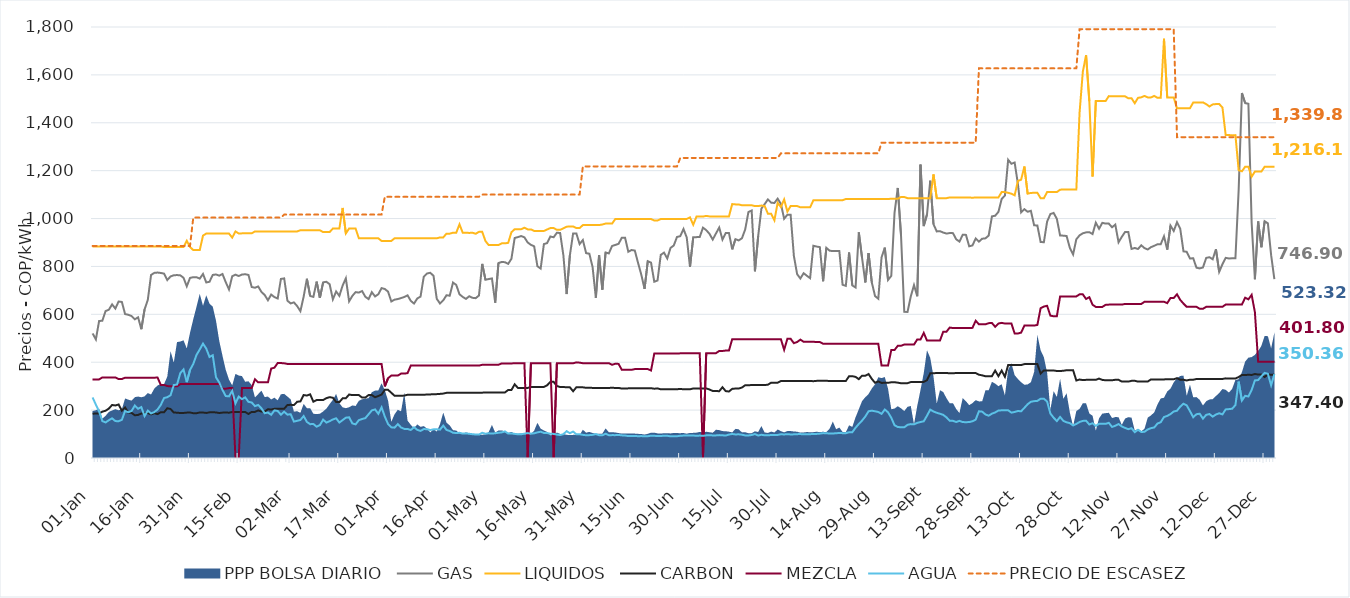
| Category | GAS | LIQUIDOS | CARBON | MEZCLA | AGUA | PRECIO DE ESCASEZ |
|---|---|---|---|---|---|---|
| 0 | 520.226 | 883.355 | 184.655 | 328.274 | 252.743 | 885.729 |
| 1900-01-01 | 495.19 | 883.355 | 186.097 | 328.274 | 222.679 | 885.729 |
| 1900-01-02 | 572.077 | 883.355 | 186.097 | 328.274 | 194.33 | 885.729 |
| 1900-01-03 | 573.32 | 883.355 | 193.517 | 336.473 | 154.081 | 885.729 |
| 1900-01-04 | 613.778 | 883.355 | 197.451 | 336.473 | 148.479 | 885.729 |
| 1900-01-05 | 619.263 | 883.355 | 206.35 | 336.473 | 157.968 | 885.729 |
| 1900-01-06 | 641.599 | 883.355 | 221.479 | 336.473 | 165.61 | 885.729 |
| 1900-01-07 | 624.019 | 883.402 | 219.356 | 336.473 | 154.121 | 885.729 |
| 1900-01-08 | 653.492 | 883.402 | 223.48 | 329.744 | 153.708 | 885.729 |
| 1900-01-09 | 651.856 | 883.402 | 197.766 | 329.744 | 159.356 | 885.729 |
| 1900-01-10 | 601.171 | 883.402 | 211.078 | 335.502 | 196.263 | 885.729 |
| 1900-01-11 | 598.072 | 883.402 | 189.093 | 335.502 | 191.205 | 885.729 |
| 1900-01-12 | 592.782 | 883.576 | 188.323 | 335.502 | 196.502 | 885.729 |
| 1900-01-13 | 579.264 | 883.576 | 178.348 | 335.502 | 219.282 | 885.729 |
| 1900-01-14 | 587.664 | 883.576 | 179.885 | 335.502 | 205.541 | 885.729 |
| 1900-01-15 | 537.89 | 883.576 | 185.696 | 335.473 | 212.525 | 885.729 |
| 1900-01-16 | 620.455 | 883.576 | 187.538 | 335.473 | 175.1 | 885.729 |
| 1900-01-17 | 660.565 | 883.576 | 187.785 | 335.473 | 197.855 | 885.729 |
| 1900-01-18 | 764.231 | 883.576 | 182.23 | 335.473 | 186.123 | 885.729 |
| 1900-01-19 | 773.113 | 883.576 | 187.213 | 335.502 | 191.726 | 885.729 |
| 1900-01-20 | 774.478 | 883.576 | 183.233 | 335.918 | 202.643 | 885.729 |
| 1900-01-21 | 772.763 | 883.576 | 191.273 | 305.125 | 221.923 | 885.729 |
| 1900-01-22 | 770.06 | 881.261 | 190.914 | 305.125 | 250.397 | 885.729 |
| 1900-01-23 | 743.273 | 881.261 | 207.706 | 300.495 | 253.961 | 885.729 |
| 1900-01-24 | 758.156 | 881.261 | 204.672 | 299.203 | 262.078 | 885.729 |
| 1900-01-25 | 763.174 | 881.261 | 189.811 | 299.203 | 304.68 | 885.729 |
| 1900-01-26 | 764.026 | 881.261 | 189.352 | 299.203 | 306.961 | 885.729 |
| 1900-01-27 | 762.766 | 881.261 | 187.888 | 308.752 | 354.241 | 885.729 |
| 1900-01-28 | 752.574 | 881.261 | 188.162 | 308.752 | 369.797 | 885.729 |
| 1900-01-29 | 717.026 | 907.181 | 189.488 | 308.752 | 316.907 | 885.729 |
| 1900-01-30 | 752.088 | 881.261 | 189.951 | 308.752 | 367.916 | 885.729 |
| 1900-01-31 | 755.145 | 868.316 | 187.148 | 309.312 | 392.801 | 1004 |
| 1900-02-01 | 755.068 | 868.316 | 187.155 | 309.312 | 430.431 | 1004 |
| 1900-02-02 | 749.131 | 868.371 | 190.092 | 309.312 | 453.319 | 1004 |
| 1900-02-03 | 768.626 | 928.718 | 189.85 | 309.312 | 477.77 | 1004 |
| 1900-02-04 | 733.194 | 937.331 | 188.176 | 309.312 | 456.861 | 1004 |
| 1900-02-05 | 736.052 | 937.331 | 190.652 | 309.312 | 421.956 | 1004 |
| 1900-02-06 | 764.639 | 937.331 | 191.107 | 309.276 | 429.166 | 1004 |
| 1900-02-07 | 766.448 | 937.331 | 190.301 | 309.276 | 337.107 | 1004 |
| 1900-02-08 | 761.602 | 937.331 | 187.87 | 309.276 | 315.424 | 1004 |
| 1900-02-09 | 768.553 | 937.331 | 189.481 | 289.274 | 284.288 | 1004 |
| 1900-02-10 | 734.412 | 937.331 | 190.093 | 289.274 | 258.703 | 1004 |
| 1900-02-11 | 703.959 | 937.331 | 189.207 | 291.978 | 257.43 | 1004 |
| 1900-02-12 | 759.067 | 920.531 | 192.154 | 291.978 | 280.627 | 1004 |
| 1900-02-13 | 765.693 | 946.212 | 192.154 | 0 | 228.574 | 1004 |
| 1900-02-14 | 759.937 | 937.745 | 191.768 | 0 | 256.456 | 1004 |
| 1900-02-15 | 766.175 | 938.122 | 191.768 | 291.978 | 245.889 | 1004 |
| 1900-02-16 | 767.474 | 938.122 | 192.156 | 291.978 | 253.112 | 1004 |
| 1900-02-17 | 764.515 | 938.164 | 183.876 | 291.978 | 234.488 | 1004 |
| 1900-02-18 | 714.133 | 938.164 | 192.598 | 291.978 | 231.856 | 1004 |
| 1900-02-19 | 711.106 | 946.297 | 192.61 | 328.667 | 216.789 | 1004 |
| 1900-02-20 | 716.412 | 946.297 | 198.772 | 315.849 | 221.514 | 1004 |
| 1900-02-21 | 693.6 | 946.297 | 193.804 | 315.849 | 207.397 | 1004 |
| 1900-02-22 | 680.697 | 946.297 | 194.178 | 315.849 | 187.162 | 1004 |
| 1900-02-23 | 658.782 | 946.297 | 203.588 | 315.849 | 189.878 | 1004 |
| 1900-02-24 | 682.461 | 946.297 | 202.434 | 373.499 | 180.456 | 1004 |
| 1900-02-25 | 672.15 | 946.297 | 205.572 | 377.277 | 198.722 | 1004 |
| 1900-02-26 | 666.018 | 946.297 | 205.572 | 396.545 | 196.472 | 1004 |
| 1900-02-27 | 747.813 | 946.297 | 206.139 | 396.545 | 180.858 | 1004 |
| 1900-02-28 | 750.156 | 946.224 | 205.753 | 395.437 | 193.233 | 1016.591 |
| 1900-02-28 | 656.943 | 946.224 | 221.252 | 392.879 | 181.047 | 1016.591 |
| 1900-03-01 | 645.614 | 946.224 | 222.146 | 392.879 | 182.888 | 1016.591 |
| 1900-03-02 | 649.864 | 946.224 | 220.939 | 392.879 | 152.143 | 1016.591 |
| 1900-03-03 | 634.457 | 946.224 | 234.899 | 392.879 | 155.283 | 1016.591 |
| 1900-03-04 | 613.276 | 951.269 | 236.342 | 392.879 | 158.788 | 1016.591 |
| 1900-03-05 | 673.885 | 951.269 | 263.018 | 392.879 | 175.164 | 1016.591 |
| 1900-03-06 | 748.508 | 951.269 | 260.744 | 392.879 | 150.685 | 1016.591 |
| 1900-03-07 | 676.691 | 951.269 | 265.949 | 392.879 | 141.311 | 1016.591 |
| 1900-03-08 | 672.928 | 951.049 | 234.996 | 392.879 | 141.898 | 1016.591 |
| 1900-03-09 | 736.6 | 951.049 | 242.017 | 392.879 | 130.732 | 1016.591 |
| 1900-03-10 | 668.471 | 951.049 | 242.017 | 392.879 | 137.422 | 1016.591 |
| 1900-03-11 | 733.519 | 943.522 | 242.017 | 392.879 | 160.203 | 1016.591 |
| 1900-03-12 | 736.034 | 943.522 | 249.959 | 392.879 | 147.907 | 1016.591 |
| 1900-03-13 | 725.859 | 943.522 | 254.051 | 392.879 | 153.853 | 1016.591 |
| 1900-03-14 | 662.456 | 958.315 | 251.69 | 392.879 | 160.91 | 1016.591 |
| 1900-03-15 | 695.33 | 958.315 | 234.065 | 392.879 | 165.861 | 1016.591 |
| 1900-03-16 | 677.135 | 958.315 | 233.301 | 392.879 | 148.141 | 1016.591 |
| 1900-03-17 | 720.054 | 1044.442 | 249.165 | 392.879 | 158.189 | 1016.591 |
| 1900-03-18 | 750.379 | 938.139 | 249.61 | 392.879 | 168.318 | 1016.591 |
| 1900-03-19 | 654.206 | 958.337 | 265.026 | 392.861 | 169.984 | 1016.591 |
| 1900-03-20 | 676.899 | 958.337 | 262.757 | 392.861 | 144.533 | 1016.591 |
| 1900-03-21 | 692.767 | 958.337 | 262.757 | 392.861 | 140.506 | 1016.591 |
| 1900-03-22 | 690.868 | 917.498 | 262.757 | 392.861 | 157.968 | 1016.591 |
| 1900-03-23 | 697.252 | 917.498 | 252.398 | 392.861 | 162.927 | 1016.591 |
| 1900-03-24 | 673.358 | 917.498 | 252.398 | 392.861 | 166.429 | 1016.591 |
| 1900-03-25 | 663.608 | 917.498 | 262.813 | 392.861 | 182.605 | 1016.591 |
| 1900-03-26 | 692.581 | 917.498 | 262.813 | 392.861 | 198.854 | 1016.591 |
| 1900-03-27 | 674.641 | 917.498 | 253.749 | 392.861 | 202.911 | 1016.591 |
| 1900-03-28 | 683.85 | 917.498 | 258.967 | 392.861 | 184.61 | 1016.591 |
| 1900-03-29 | 709.512 | 906.627 | 264.87 | 392.861 | 211.776 | 1016.591 |
| 1900-03-30 | 705.818 | 906.535 | 284.521 | 299.126 | 172.887 | 1090.843 |
| 1900-03-31 | 694.863 | 906.535 | 284.521 | 333.191 | 141.739 | 1090.843 |
| 1900-04-01 | 653.647 | 906.535 | 272.534 | 344.248 | 127.997 | 1090.843 |
| 1900-04-02 | 661.3 | 917.415 | 259.737 | 344.248 | 126.719 | 1090.843 |
| 1900-04-03 | 663.776 | 917.415 | 259.737 | 344.248 | 141.479 | 1090.843 |
| 1900-04-04 | 667.795 | 917.415 | 259.737 | 352.402 | 127.418 | 1090.843 |
| 1900-04-05 | 672.4 | 917.415 | 260.754 | 352.402 | 121.535 | 1090.843 |
| 1900-04-06 | 679.439 | 917.415 | 264.094 | 354.458 | 121.306 | 1090.843 |
| 1900-04-07 | 656.223 | 917.415 | 264.094 | 385.951 | 117.012 | 1090.843 |
| 1900-04-08 | 644.986 | 917.415 | 264.094 | 385.951 | 128.474 | 1090.843 |
| 1900-04-09 | 666.242 | 917.415 | 264.094 | 385.951 | 117.554 | 1090.843 |
| 1900-04-10 | 674.078 | 917.415 | 264.094 | 385.951 | 113.146 | 1090.843 |
| 1900-04-11 | 757.191 | 917.415 | 264.094 | 385.951 | 120.719 | 1090.843 |
| 1900-04-12 | 770.519 | 917.415 | 265.171 | 385.951 | 120.428 | 1090.843 |
| 1900-04-13 | 773.63 | 917.415 | 265.48 | 385.951 | 116.799 | 1090.843 |
| 1900-04-14 | 760.937 | 917.415 | 266.754 | 385.951 | 119.608 | 1090.843 |
| 1900-04-15 | 664.894 | 917.415 | 266.754 | 385.951 | 119.939 | 1090.843 |
| 1900-04-16 | 644.989 | 921.403 | 267.735 | 385.951 | 118.534 | 1090.843 |
| 1900-04-17 | 658.457 | 921.403 | 269.08 | 385.951 | 135.334 | 1090.843 |
| 1900-04-18 | 679.775 | 937.038 | 272.066 | 385.951 | 117.239 | 1090.843 |
| 1900-04-19 | 677.714 | 937.038 | 272.066 | 385.951 | 112.744 | 1090.843 |
| 1900-04-20 | 732.776 | 940.825 | 272.066 | 385.951 | 105.626 | 1090.843 |
| 1900-04-21 | 722.749 | 940.825 | 272.066 | 385.951 | 104.234 | 1090.843 |
| 1900-04-22 | 683.739 | 975.886 | 272.066 | 385.951 | 105.206 | 1090.843 |
| 1900-04-23 | 672.722 | 940.825 | 272.066 | 385.951 | 101.845 | 1090.843 |
| 1900-04-24 | 664.504 | 940.825 | 272.644 | 385.951 | 102.858 | 1090.843 |
| 1900-04-25 | 675.516 | 939.999 | 272.644 | 385.951 | 101.125 | 1090.843 |
| 1900-04-26 | 668.92 | 940.825 | 272.644 | 385.951 | 99.339 | 1090.843 |
| 1900-04-27 | 667.528 | 936.509 | 272.65 | 385.951 | 98.182 | 1090.843 |
| 1900-04-28 | 678.698 | 944.468 | 272.421 | 385.951 | 97.644 | 1090.843 |
| 1900-04-29 | 810.606 | 944.569 | 272.958 | 389.368 | 105.465 | 1100.221 |
| 1900-04-30 | 744.388 | 906.046 | 273.368 | 389.368 | 101.25 | 1100.221 |
| 1900-05-01 | 747.315 | 889.134 | 273.368 | 389.368 | 103.113 | 1100.221 |
| 1900-05-02 | 749.902 | 889.134 | 273.368 | 389.368 | 101.828 | 1100.221 |
| 1900-05-03 | 648.703 | 889.134 | 273.368 | 389.368 | 103.431 | 1100.221 |
| 1900-05-04 | 814.159 | 889.134 | 273.598 | 389.434 | 105.432 | 1100.221 |
| 1900-05-05 | 818.599 | 896.453 | 273.885 | 395.007 | 107.078 | 1100.221 |
| 1900-05-06 | 817.788 | 896.453 | 273.885 | 395.007 | 110.953 | 1100.221 |
| 1900-05-07 | 810.717 | 898.53 | 284.053 | 395.007 | 101.858 | 1100.221 |
| 1900-05-08 | 832.085 | 943.105 | 284.053 | 395.007 | 102.692 | 1100.221 |
| 1900-05-09 | 918.938 | 955.385 | 307.625 | 395.557 | 100.735 | 1100.221 |
| 1900-05-10 | 922.513 | 955.385 | 292.643 | 395.557 | 98.843 | 1100.221 |
| 1900-05-11 | 927.026 | 955.385 | 292.643 | 395.557 | 99.195 | 1100.221 |
| 1900-05-12 | 921.479 | 961.745 | 292.643 | 395.557 | 101.622 | 1100.221 |
| 1900-05-13 | 900.284 | 954.771 | 292.643 | 0 | 103.995 | 1100.221 |
| 1900-05-14 | 890.262 | 954.771 | 296.458 | 395.557 | 101.598 | 1100.221 |
| 1900-05-15 | 884.252 | 948.15 | 296.458 | 395.557 | 103.133 | 1100.221 |
| 1900-05-16 | 800.931 | 948.15 | 296.458 | 395.557 | 106.922 | 1100.221 |
| 1900-05-17 | 791.082 | 948.15 | 296.458 | 395.557 | 109.859 | 1100.221 |
| 1900-05-18 | 893.421 | 948.15 | 296.896 | 395.557 | 104.656 | 1100.221 |
| 1900-05-19 | 897.563 | 954.343 | 303.723 | 395.557 | 104.168 | 1100.221 |
| 1900-05-20 | 924.992 | 960.386 | 318.044 | 395.557 | 101.367 | 1100.221 |
| 1900-05-21 | 921.853 | 960.386 | 318.044 | 0 | 100.622 | 1100.221 |
| 1900-05-22 | 940.626 | 952.917 | 300.59 | 395.557 | 97.819 | 1100.221 |
| 1900-05-23 | 939.821 | 952.917 | 296.458 | 395.557 | 95.786 | 1100.221 |
| 1900-05-24 | 846.637 | 959.145 | 296.458 | 395.557 | 99.368 | 1100.221 |
| 1900-05-25 | 684.697 | 966.003 | 295.306 | 395.557 | 112.149 | 1100.221 |
| 1900-05-26 | 846.269 | 967.149 | 295.306 | 395.557 | 103.425 | 1100.221 |
| 1900-05-27 | 937.923 | 967.149 | 278.764 | 395.557 | 110.399 | 1100.221 |
| 1900-05-28 | 937.698 | 960.307 | 295.306 | 399.421 | 98.891 | 1100.221 |
| 1900-05-29 | 893.489 | 960.307 | 295.306 | 398.186 | 99.134 | 1100.221 |
| 1900-05-30 | 910.327 | 972.714 | 295.203 | 395.872 | 96.748 | 1217.8 |
| 1900-05-31 | 855.573 | 972.832 | 293.041 | 395.872 | 94.861 | 1217.8 |
| 1900-06-01 | 853.153 | 972.832 | 293.394 | 395.872 | 95.495 | 1217.8 |
| 1900-06-02 | 797.138 | 972.832 | 292.724 | 395.872 | 96.633 | 1217.8 |
| 1900-06-03 | 669.382 | 972.832 | 292.724 | 395.872 | 100.01 | 1217.8 |
| 1900-06-04 | 847.87 | 972.832 | 292.724 | 395.872 | 95.185 | 1217.8 |
| 1900-06-05 | 703.011 | 975.088 | 292.724 | 395.872 | 94.909 | 1217.8 |
| 1900-06-06 | 858.374 | 979.006 | 292.724 | 395.872 | 101.385 | 1217.8 |
| 1900-06-07 | 854.355 | 979.006 | 292.724 | 395.872 | 95.172 | 1217.8 |
| 1900-06-08 | 885.466 | 979.006 | 293.075 | 389.321 | 95.573 | 1217.8 |
| 1900-06-09 | 889.772 | 998.062 | 292.724 | 393.806 | 95.479 | 1217.8 |
| 1900-06-10 | 894.454 | 998.062 | 292.724 | 392.933 | 96.249 | 1217.8 |
| 1900-06-11 | 919.994 | 998.062 | 289.957 | 368.239 | 94.566 | 1217.8 |
| 1900-06-12 | 920.068 | 998.062 | 289.957 | 368.239 | 93.769 | 1217.8 |
| 1900-06-13 | 861.322 | 998.062 | 290.852 | 368.239 | 91.626 | 1217.8 |
| 1900-06-14 | 868.627 | 998.062 | 291.695 | 368.239 | 91.944 | 1217.8 |
| 1900-06-15 | 866.392 | 998.062 | 291.59 | 371.301 | 91.776 | 1217.8 |
| 1900-06-16 | 814.907 | 998.062 | 291.695 | 371.301 | 91.167 | 1217.8 |
| 1900-06-17 | 765.73 | 998.062 | 291.695 | 371.301 | 91.405 | 1217.8 |
| 1900-06-18 | 706.228 | 998.062 | 291.695 | 371.301 | 90.951 | 1217.8 |
| 1900-06-19 | 821.984 | 998.062 | 291.695 | 371.301 | 90.943 | 1217.8 |
| 1900-06-20 | 815.843 | 998.062 | 291.58 | 365.435 | 93.27 | 1217.8 |
| 1900-06-21 | 736.115 | 991.842 | 289.329 | 435.935 | 92.716 | 1217.8 |
| 1900-06-22 | 741.456 | 991.842 | 290.719 | 435.935 | 91.601 | 1217.8 |
| 1900-06-23 | 848.481 | 998.062 | 286.818 | 435.935 | 91.855 | 1217.8 |
| 1900-06-24 | 857.631 | 998.062 | 286.685 | 435.935 | 93.13 | 1217.8 |
| 1900-06-25 | 833.184 | 998.062 | 286.818 | 435.935 | 92.882 | 1217.8 |
| 1900-06-26 | 877.368 | 998.062 | 286.818 | 435.935 | 90.57 | 1217.8 |
| 1900-06-27 | 887.47 | 998.062 | 286.818 | 435.935 | 90.728 | 1217.8 |
| 1900-06-28 | 923.241 | 998.062 | 287.214 | 435.935 | 90.89 | 1217.8 |
| 1900-06-29 | 926.372 | 998.38 | 288.403 | 437.149 | 92.877 | 1253.099 |
| 1900-06-30 | 956.385 | 998.38 | 287.025 | 437.149 | 93.585 | 1253.099 |
| 1900-07-01 | 920.963 | 998.38 | 287.025 | 437.209 | 93.586 | 1253.099 |
| 1900-07-02 | 797.878 | 1005.08 | 287.025 | 437.209 | 94.438 | 1253.099 |
| 1900-07-03 | 922.05 | 974.127 | 290.434 | 437.209 | 93.939 | 1253.099 |
| 1900-07-04 | 922.427 | 1008.299 | 290.434 | 437.209 | 92.615 | 1253.099 |
| 1900-07-05 | 922.865 | 1008.299 | 290.434 | 437.209 | 93.693 | 1253.099 |
| 1900-07-06 | 961.882 | 1008.299 | 290.434 | 0 | 92.592 | 1253.099 |
| 1900-07-07 | 951.614 | 1011.109 | 290.434 | 437.868 | 94.572 | 1253.099 |
| 1900-07-08 | 936.224 | 1008.946 | 286.266 | 437.868 | 94.738 | 1253.099 |
| 1900-07-09 | 912.305 | 1008.946 | 279.749 | 437.868 | 94.413 | 1253.099 |
| 1900-07-10 | 937.726 | 1008.946 | 279.787 | 437.868 | 94.405 | 1253.099 |
| 1900-07-11 | 962.547 | 1008.946 | 278.913 | 446.934 | 95.572 | 1253.099 |
| 1900-07-12 | 912.303 | 1008.946 | 295.655 | 446.934 | 94.787 | 1253.099 |
| 1900-07-13 | 939.699 | 1008.946 | 279.348 | 448.747 | 93.664 | 1253.099 |
| 1900-07-14 | 939.736 | 1008.946 | 277.642 | 448.747 | 97.861 | 1253.099 |
| 1900-07-15 | 871.369 | 1060.436 | 288.769 | 495.967 | 100.358 | 1253.099 |
| 1900-07-16 | 913.97 | 1059.189 | 290.138 | 495.999 | 98.318 | 1253.099 |
| 1900-07-17 | 908.555 | 1058.962 | 290.138 | 495.999 | 98.917 | 1253.099 |
| 1900-07-18 | 917.682 | 1055.509 | 294.174 | 495.999 | 97.397 | 1253.099 |
| 1900-07-19 | 954.336 | 1055.509 | 304.006 | 496.144 | 94.073 | 1253.099 |
| 1900-07-20 | 1027.164 | 1055.509 | 304.006 | 496.144 | 94.127 | 1253.099 |
| 1900-07-21 | 1033.645 | 1055.509 | 304.632 | 496.144 | 95.964 | 1253.099 |
| 1900-07-22 | 779.738 | 1052.161 | 304.632 | 496.144 | 100.035 | 1253.099 |
| 1900-07-23 | 926.573 | 1052.161 | 304.632 | 496.144 | 93.882 | 1253.099 |
| 1900-07-24 | 1041.979 | 1054.258 | 304.632 | 496.144 | 97.044 | 1253.099 |
| 1900-07-25 | 1060.286 | 1052.161 | 304.632 | 496.144 | 94.825 | 1253.099 |
| 1900-07-26 | 1080.109 | 1020.398 | 306.151 | 496.144 | 94.551 | 1253.099 |
| 1900-07-27 | 1066.339 | 1020.398 | 314.508 | 496.144 | 96.1 | 1253.099 |
| 1900-07-28 | 1065.033 | 992.494 | 314.508 | 496.144 | 96.002 | 1253.099 |
| 1900-07-29 | 1083.036 | 1065.911 | 314.508 | 496.144 | 96.374 | 1253.099 |
| 1900-07-30 | 1061.414 | 1048.12 | 321.45 | 496.144 | 99.161 | 1272.366 |
| 1900-07-31 | 999.245 | 1079.729 | 321.621 | 452.04 | 98.33 | 1272.366 |
| 1900-08-01 | 1015.959 | 1029.041 | 321.589 | 497.836 | 99.519 | 1272.366 |
| 1900-08-02 | 1015.959 | 1052.406 | 321.589 | 497.836 | 98.301 | 1272.366 |
| 1900-08-03 | 843.939 | 1052.406 | 321.589 | 479.569 | 98.734 | 1272.366 |
| 1900-08-04 | 767.745 | 1052.406 | 321.589 | 484.432 | 99.64 | 1272.366 |
| 1900-08-05 | 749.776 | 1046.862 | 321.676 | 494.272 | 99.871 | 1272.366 |
| 1900-08-06 | 771.774 | 1046.862 | 321.676 | 485.394 | 98.978 | 1272.366 |
| 1900-08-07 | 761 | 1046.862 | 321.676 | 485.394 | 99.212 | 1272.366 |
| 1900-08-08 | 751.067 | 1046.862 | 321.676 | 485.394 | 99.593 | 1272.366 |
| 1900-08-09 | 886.404 | 1076.196 | 320.82 | 485.394 | 99.979 | 1272.366 |
| 1900-08-10 | 883.067 | 1076.196 | 322.116 | 484.322 | 100.636 | 1272.366 |
| 1900-08-11 | 880.784 | 1076.664 | 322.116 | 484.322 | 101.844 | 1272.366 |
| 1900-08-12 | 738.176 | 1076.664 | 322.116 | 477.101 | 103.905 | 1272.366 |
| 1900-08-13 | 877.83 | 1076.664 | 322.518 | 477.101 | 103.668 | 1272.366 |
| 1900-08-14 | 865.851 | 1076.664 | 321.526 | 477.101 | 101.927 | 1272.366 |
| 1900-08-15 | 863.997 | 1076.664 | 321.526 | 477.101 | 102.465 | 1272.366 |
| 1900-08-16 | 864.094 | 1076.664 | 321.526 | 477.101 | 103.246 | 1272.366 |
| 1900-08-17 | 864.094 | 1076.664 | 321.526 | 477.101 | 104.638 | 1272.366 |
| 1900-08-18 | 723.566 | 1076.664 | 321.526 | 477.101 | 103.745 | 1272.366 |
| 1900-08-19 | 718.964 | 1081.597 | 321.526 | 477.101 | 103.554 | 1272.366 |
| 1900-08-20 | 858.346 | 1081.597 | 341.784 | 477.101 | 107.626 | 1272.366 |
| 1900-08-21 | 720.336 | 1081.597 | 341.784 | 477.101 | 107.714 | 1272.366 |
| 1900-08-22 | 712.296 | 1081.597 | 338.612 | 477.101 | 126.426 | 1272.366 |
| 1900-08-23 | 942.469 | 1081.597 | 329.259 | 477.101 | 142.033 | 1272.366 |
| 1900-08-24 | 836.299 | 1081.597 | 343.863 | 477.101 | 156.256 | 1272.366 |
| 1900-08-25 | 733.04 | 1081.597 | 343.36 | 477.101 | 173.26 | 1272.366 |
| 1900-08-26 | 855.415 | 1081.597 | 350.634 | 477.101 | 195.158 | 1272.366 |
| 1900-08-27 | 733.334 | 1081.597 | 330.358 | 477.101 | 197.651 | 1272.366 |
| 1900-08-28 | 676.269 | 1081.597 | 314.118 | 477.101 | 195.126 | 1272.366 |
| 1900-08-29 | 665.131 | 1081.597 | 319.69 | 477.068 | 192.283 | 1272.366 |
| 1900-08-30 | 837.542 | 1081.562 | 313.635 | 386.145 | 184.479 | 1316.899 |
| 1900-08-31 | 878.555 | 1081.562 | 313.932 | 386.145 | 202.575 | 1316.899 |
| 1900-09-01 | 743.625 | 1081.562 | 313.794 | 386.145 | 190.759 | 1316.899 |
| 1900-09-02 | 760.334 | 1082.83 | 316.368 | 450.814 | 167.983 | 1316.899 |
| 1900-09-03 | 1023.528 | 1082.83 | 316.396 | 450.814 | 136.842 | 1316.899 |
| 1900-09-04 | 1127.647 | 1082.83 | 314.623 | 468.636 | 129.503 | 1316.899 |
| 1900-09-05 | 930.455 | 1089.947 | 312.177 | 468.636 | 128.372 | 1316.899 |
| 1900-09-06 | 610.268 | 1089.947 | 312.578 | 473.862 | 128.2 | 1316.899 |
| 1900-09-07 | 610.019 | 1085.268 | 312.578 | 473.862 | 138.448 | 1316.899 |
| 1900-09-08 | 674.109 | 1085.268 | 317.033 | 473.656 | 141.518 | 1316.899 |
| 1900-09-09 | 721.889 | 1085.268 | 317.033 | 473.656 | 140.685 | 1316.899 |
| 1900-09-10 | 675.216 | 1085.268 | 317.033 | 495.182 | 146.697 | 1316.899 |
| 1900-09-11 | 1225.3 | 1085.268 | 317.033 | 495.182 | 150.274 | 1316.899 |
| 1900-09-12 | 968.57 | 1085.268 | 317.832 | 522.514 | 153.275 | 1316.899 |
| 1900-09-13 | 1016.903 | 1085.268 | 324.998 | 490.498 | 176.534 | 1316.899 |
| 1900-09-14 | 1158.091 | 1085.268 | 353.429 | 490.498 | 202.041 | 1316.899 |
| 1900-09-15 | 976.508 | 1184.302 | 353.429 | 490.498 | 194.267 | 1316.899 |
| 1900-09-16 | 946.289 | 1085.268 | 355.278 | 490.498 | 188.831 | 1316.899 |
| 1900-09-17 | 947.248 | 1085.268 | 355.278 | 490.498 | 184.77 | 1316.899 |
| 1900-09-18 | 941.521 | 1085.268 | 355.278 | 527.354 | 180.082 | 1316.899 |
| 1900-09-19 | 937.263 | 1085.268 | 355.278 | 527.354 | 169.8 | 1316.899 |
| 1900-09-20 | 939.434 | 1088.147 | 353.429 | 544.733 | 155.369 | 1316.899 |
| 1900-09-21 | 939.129 | 1088.147 | 354.023 | 542.792 | 155.111 | 1316.899 |
| 1900-09-22 | 913.321 | 1088.147 | 354.797 | 542.792 | 150.436 | 1316.899 |
| 1900-09-23 | 903.914 | 1088.147 | 354.793 | 542.792 | 155.076 | 1316.899 |
| 1900-09-24 | 931.928 | 1088.147 | 354.793 | 542.792 | 149.986 | 1316.899 |
| 1900-09-25 | 931.822 | 1088.148 | 354.793 | 542.792 | 149.657 | 1316.899 |
| 1900-09-26 | 884.13 | 1088.148 | 354.793 | 542.792 | 149.983 | 1316.899 |
| 1900-09-27 | 887.773 | 1086.852 | 354.793 | 543.462 | 153.532 | 1316.899 |
| 1900-09-28 | 916.574 | 1088.148 | 354.851 | 573.17 | 160.371 | 1316.899 |
| 1900-09-29 | 903.561 | 1088.176 | 347.821 | 558.242 | 195.088 | 1627.258 |
| 1900-09-30 | 915.807 | 1088.176 | 345.149 | 558.242 | 193.574 | 1627.258 |
| 1900-10-01 | 917.334 | 1088.176 | 341.444 | 558.242 | 181.865 | 1627.258 |
| 1900-10-02 | 929.025 | 1088.176 | 341.536 | 563.125 | 176.755 | 1627.258 |
| 1900-10-03 | 1009.066 | 1088.176 | 341.852 | 563.937 | 185.118 | 1627.258 |
| 1900-10-04 | 1011.867 | 1088.206 | 365.049 | 548.034 | 190.417 | 1627.258 |
| 1900-10-05 | 1027.864 | 1088.206 | 341.758 | 561.693 | 198.157 | 1627.258 |
| 1900-10-06 | 1081.758 | 1110.546 | 365.023 | 564.308 | 199.202 | 1627.258 |
| 1900-10-07 | 1095.903 | 1110.546 | 339.32 | 561.706 | 199.192 | 1627.258 |
| 1900-10-08 | 1245.227 | 1107.489 | 388.178 | 561.706 | 199.309 | 1627.258 |
| 1900-10-09 | 1228.773 | 1103.734 | 388.178 | 561.706 | 189.474 | 1627.258 |
| 1900-10-10 | 1234.013 | 1096.943 | 388.178 | 519.99 | 192.338 | 1627.258 |
| 1900-10-11 | 1144.827 | 1157.003 | 388.178 | 519.99 | 196.217 | 1627.258 |
| 1900-10-12 | 1025.653 | 1162.448 | 388.178 | 523.635 | 195.187 | 1627.258 |
| 1900-10-13 | 1039.097 | 1217.331 | 392.164 | 552.941 | 209.576 | 1627.258 |
| 1900-10-14 | 1028.432 | 1103.975 | 392.164 | 552.941 | 224.504 | 1627.258 |
| 1900-10-15 | 1032.216 | 1107.046 | 392.164 | 552.941 | 234.801 | 1627.258 |
| 1900-10-16 | 971.957 | 1107.489 | 392.164 | 552.941 | 237.416 | 1627.258 |
| 1900-10-17 | 970.87 | 1107.489 | 392.164 | 555.827 | 238.509 | 1627.258 |
| 1900-10-18 | 902.084 | 1085.015 | 352.647 | 625.887 | 247.435 | 1627.258 |
| 1900-10-19 | 901.182 | 1085.015 | 365.438 | 632.431 | 247.867 | 1627.258 |
| 1900-10-20 | 987.308 | 1110.546 | 365.438 | 635.703 | 235.66 | 1627.258 |
| 1900-10-21 | 1018.732 | 1110.546 | 365.438 | 594.612 | 185.91 | 1627.258 |
| 1900-10-22 | 1023.45 | 1110.546 | 365.438 | 591.928 | 168.338 | 1627.258 |
| 1900-10-23 | 998.806 | 1110.546 | 363.415 | 591.928 | 154.204 | 1627.258 |
| 1900-10-24 | 929.299 | 1120.502 | 363.415 | 674.966 | 171.496 | 1627.258 |
| 1900-10-25 | 928.554 | 1121.509 | 364.212 | 674.966 | 155.005 | 1627.258 |
| 1900-10-26 | 927.155 | 1121.509 | 366.761 | 674.966 | 148.98 | 1627.258 |
| 1900-10-27 | 877.638 | 1121.509 | 366.761 | 674.966 | 145.617 | 1627.258 |
| 1900-10-28 | 849.939 | 1121.509 | 366.761 | 674.966 | 135.929 | 1627.258 |
| 1900-10-29 | 913.544 | 1121.509 | 323.623 | 674.966 | 142.326 | 1627.258 |
| 1900-10-30 | 929.908 | 1443.199 | 327.759 | 683.405 | 150.326 | 1790.952 |
| 1900-10-31 | 938.482 | 1613.582 | 325.409 | 683.405 | 154.953 | 1790.952 |
| 1900-11-01 | 942.21 | 1682.623 | 326.366 | 664.156 | 155.74 | 1790.952 |
| 1900-11-02 | 943.218 | 1490.529 | 326.366 | 671.594 | 139.919 | 1790.952 |
| 1900-11-03 | 935.316 | 1175.698 | 326.366 | 640.054 | 145.22 | 1790.952 |
| 1900-11-04 | 982.643 | 1490.529 | 326.366 | 630.93 | 134.038 | 1790.952 |
| 1900-11-05 | 957.366 | 1490.529 | 331.683 | 630.93 | 142.749 | 1790.952 |
| 1900-11-06 | 982.09 | 1490.529 | 326.159 | 630.93 | 143.128 | 1790.952 |
| 1900-11-07 | 978.967 | 1490.529 | 324.614 | 639.494 | 142.62 | 1790.952 |
| 1900-11-08 | 978.875 | 1511.257 | 324.614 | 640.546 | 146.91 | 1790.952 |
| 1900-11-09 | 963.605 | 1510.513 | 324.614 | 640.546 | 129.802 | 1790.952 |
| 1900-11-10 | 974.734 | 1510.513 | 326.691 | 640.546 | 134.648 | 1790.952 |
| 1900-11-11 | 900.916 | 1510.513 | 326.691 | 640.546 | 141.775 | 1790.952 |
| 1900-11-12 | 923.547 | 1510.513 | 319.106 | 640.546 | 131.872 | 1790.952 |
| 1900-11-13 | 943.863 | 1510.513 | 319.106 | 643.396 | 125.603 | 1790.952 |
| 1900-11-14 | 944.037 | 1502.449 | 319.106 | 643.396 | 120.443 | 1790.952 |
| 1900-11-15 | 873.131 | 1502.449 | 322.133 | 643.396 | 124.349 | 1790.952 |
| 1900-11-16 | 877.139 | 1481.655 | 322.437 | 643.396 | 107.882 | 1790.952 |
| 1900-11-17 | 872.95 | 1504.171 | 319.217 | 643.396 | 117.9 | 1790.952 |
| 1900-11-18 | 888.258 | 1506.278 | 319.013 | 643.396 | 108.484 | 1790.952 |
| 1900-11-19 | 876.57 | 1512.098 | 319.013 | 652.563 | 109.459 | 1790.952 |
| 1900-11-20 | 870.842 | 1505.921 | 319.42 | 652.563 | 119.407 | 1790.952 |
| 1900-11-21 | 880.686 | 1505.921 | 328.225 | 652.563 | 124.599 | 1790.952 |
| 1900-11-22 | 886.207 | 1512.098 | 328.075 | 652.563 | 127.588 | 1790.952 |
| 1900-11-23 | 892.848 | 1504.171 | 328.225 | 652.563 | 143.929 | 1790.952 |
| 1900-11-24 | 893.137 | 1504.171 | 328.225 | 652.563 | 149.576 | 1790.952 |
| 1900-11-25 | 926.035 | 1750.739 | 328.225 | 652.563 | 171.179 | 1790.952 |
| 1900-11-26 | 870.283 | 1505.921 | 328.907 | 646.772 | 175.697 | 1790.952 |
| 1900-11-27 | 970.401 | 1505.921 | 328.907 | 668.155 | 183.463 | 1790.952 |
| 1900-11-28 | 948.085 | 1505.921 | 328.907 | 668.155 | 194.098 | 1790.952 |
| 1900-11-29 | 984.419 | 1460.65 | 333.491 | 683.687 | 197.553 | 1339.849 |
| 1900-11-30 | 957.826 | 1460.65 | 326.811 | 660.312 | 214.403 | 1339.849 |
| 1900-12-01 | 863.045 | 1460.65 | 326.811 | 644.849 | 226.79 | 1339.849 |
| 1900-12-02 | 861.137 | 1460.65 | 323.815 | 631.368 | 219.787 | 1339.849 |
| 1900-12-03 | 833.152 | 1460.65 | 326.963 | 631.368 | 195.753 | 1339.849 |
| 1900-12-04 | 834.19 | 1484.583 | 326.963 | 631.368 | 170.332 | 1339.849 |
| 1900-12-05 | 794.853 | 1484.873 | 329.886 | 631.368 | 182.823 | 1339.849 |
| 1900-12-06 | 791.776 | 1484.873 | 329.886 | 623.246 | 184.925 | 1339.849 |
| 1900-12-07 | 795.713 | 1485.211 | 329.886 | 623.246 | 164.389 | 1339.849 |
| 1900-12-08 | 835.654 | 1477.798 | 329.886 | 631.368 | 180.179 | 1339.849 |
| 1900-12-09 | 838.6 | 1468.057 | 329.886 | 631.368 | 183.493 | 1339.849 |
| 1900-12-10 | 829.988 | 1476.673 | 330.059 | 631.368 | 172.709 | 1339.849 |
| 1900-12-11 | 871.852 | 1478.183 | 330.059 | 631.368 | 181.578 | 1339.849 |
| 1900-12-12 | 777.345 | 1478.183 | 330.194 | 631.368 | 186.884 | 1339.849 |
| 1900-12-13 | 809.068 | 1464.243 | 330.151 | 631.368 | 182.122 | 1339.849 |
| 1900-12-14 | 836.073 | 1348.985 | 332.574 | 640.799 | 202.828 | 1339.849 |
| 1900-12-15 | 832.828 | 1348.985 | 331.823 | 640.799 | 204.144 | 1339.849 |
| 1900-12-16 | 833.865 | 1347.307 | 331.823 | 640.799 | 205.839 | 1339.849 |
| 1900-12-17 | 834.181 | 1348.373 | 331.823 | 640.799 | 221.052 | 1339.849 |
| 1900-12-18 | 1119.611 | 1201.815 | 338.175 | 640.799 | 318.852 | 1339.849 |
| 1900-12-19 | 1524.16 | 1197.484 | 346.75 | 640.799 | 240.138 | 1339.849 |
| 1900-12-20 | 1482.449 | 1216.413 | 346.253 | 669.436 | 259.75 | 1339.849 |
| 1900-12-21 | 1479.581 | 1216.185 | 347.812 | 662.657 | 256.86 | 1339.849 |
| 1900-12-22 | 981.97 | 1174.711 | 346.79 | 681.346 | 284.309 | 1339.849 |
| 1900-12-23 | 746.329 | 1196.309 | 350.749 | 609.036 | 323.946 | 1339.849 |
| 1900-12-24 | 987.793 | 1196.309 | 348.457 | 401.993 | 325.487 | 1339.849 |
| 1900-12-25 | 880.191 | 1196.309 | 348.457 | 401.8 | 341.171 | 1339.849 |
| 1900-12-26 | 988.517 | 1216.185 | 338.19 | 401.8 | 355.376 | 1339.849 |
| 1900-12-27 | 979.852 | 1216.185 | 349.374 | 401.8 | 351.718 | 1339.849 |
| 1900-12-28 | 847.021 | 1216.185 | 347.396 | 401.8 | 303.68 | 1339.849 |
| 1900-12-29 | 746.896 | 1216.185 | 347.396 | 401.8 | 350.364 | 1339.849 |